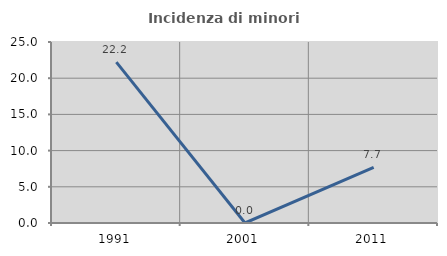
| Category | Incidenza di minori stranieri |
|---|---|
| 1991.0 | 22.222 |
| 2001.0 | 0 |
| 2011.0 | 7.692 |